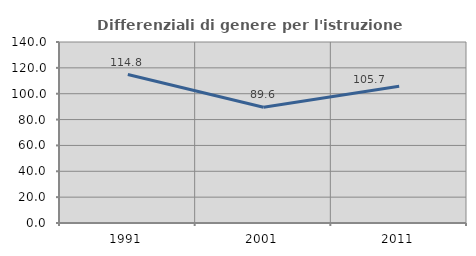
| Category | Differenziali di genere per l'istruzione superiore |
|---|---|
| 1991.0 | 114.838 |
| 2001.0 | 89.568 |
| 2011.0 | 105.747 |